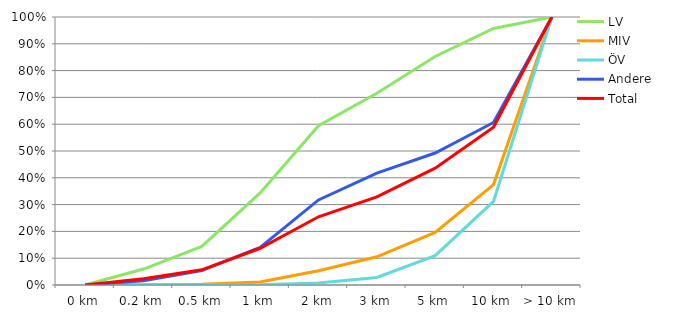
| Category | LV | MIV | ÖV | Andere | Total |
|---|---|---|---|---|---|
| 0 km | 0 | 0 | 0 | 0 | 0 |
| 0.2 km | 0.06 | 0.001 | 0 | 0.016 | 0.023 |
| 0.5 km | 0.144 | 0.003 | 0 | 0.054 | 0.057 |
| 1 km | 0.344 | 0.011 | 0.001 | 0.141 | 0.137 |
| 2 km | 0.594 | 0.053 | 0.008 | 0.317 | 0.254 |
| 3 km | 0.715 | 0.105 | 0.028 | 0.417 | 0.329 |
| 5 km | 0.853 | 0.197 | 0.11 | 0.492 | 0.436 |
| 10 km | 0.957 | 0.375 | 0.312 | 0.606 | 0.589 |
| > 10 km | 1 | 1 | 1 | 1 | 1 |